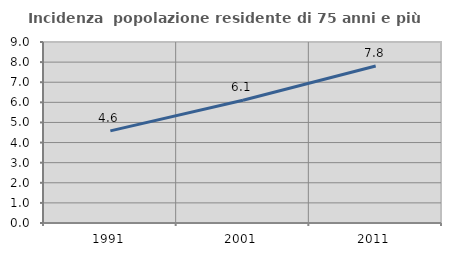
| Category | Incidenza  popolazione residente di 75 anni e più |
|---|---|
| 1991.0 | 4.582 |
| 2001.0 | 6.103 |
| 2011.0 | 7.804 |